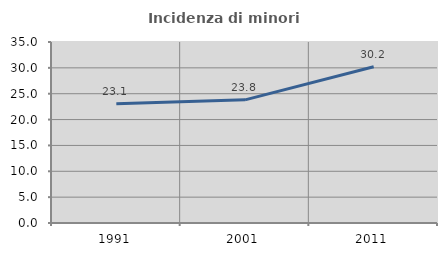
| Category | Incidenza di minori stranieri |
|---|---|
| 1991.0 | 23.077 |
| 2001.0 | 23.81 |
| 2011.0 | 30.226 |